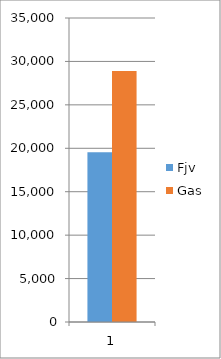
| Category | Fjv | Gas |
|---|---|---|
| 0 | 19553.989 | 28890 |